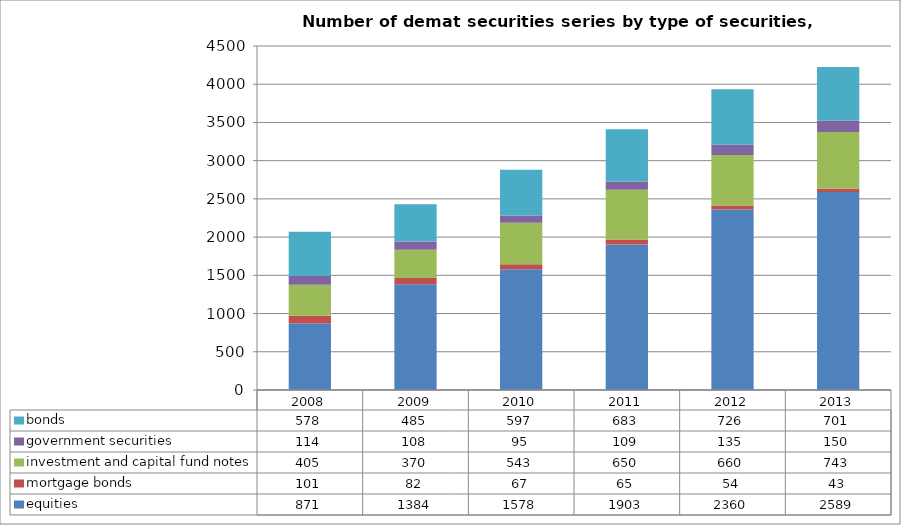
| Category | equities | mortgage bonds | investment and capital fund notes | government securities | bonds |
|---|---|---|---|---|---|
| 2008.0 | 871 | 101 | 405 | 114 | 578 |
| 2009.0 | 1384 | 82 | 370 | 108 | 485 |
| 2010.0 | 1578 | 67 | 543 | 95 | 597 |
| 2011.0 | 1903 | 65 | 650 | 109 | 683 |
| 2012.0 | 2360 | 54 | 660 | 135 | 726 |
| 2013.0 | 2589 | 43 | 743 | 150 | 701 |